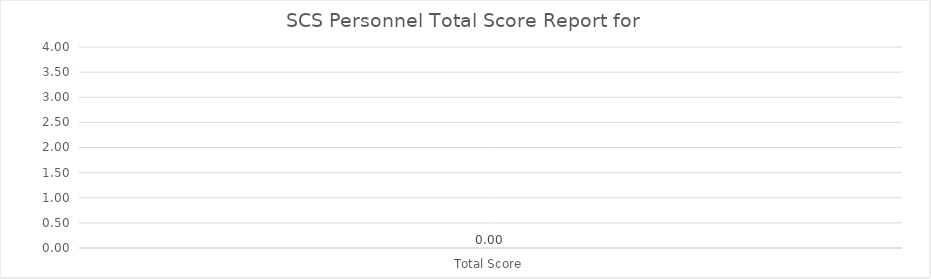
| Category | 0 |
|---|---|
| Total Score | 0 |